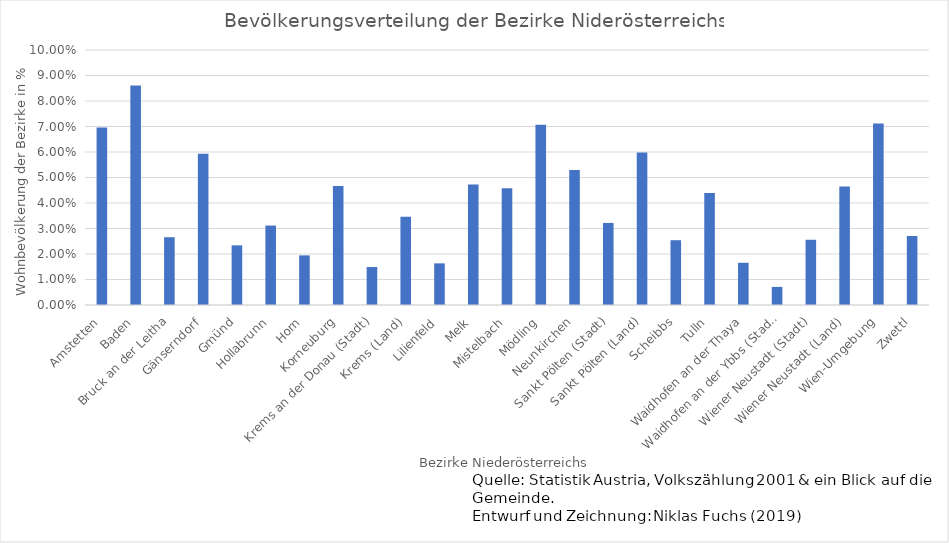
| Category | Series 0 |
|---|---|
| Amstetten | 0.07 |
| Baden | 0.086 |
| Bruck an der Leitha | 0.027 |
| Gänserndorf | 0.059 |
| Gmünd | 0.023 |
| Hollabrunn | 0.031 |
| Horn | 0.019 |
| Korneuburg | 0.047 |
| Krems an der Donau (Stadt) | 0.015 |
| Krems (Land) | 0.035 |
| Lilienfeld | 0.016 |
| Melk | 0.047 |
| Mistelbach | 0.046 |
| Mödling | 0.071 |
| Neunkirchen | 0.053 |
| Sankt Pölten (Stadt) | 0.032 |
| Sankt Pölten (Land) | 0.06 |
| Scheibbs | 0.025 |
| Tulln | 0.044 |
| Waidhofen an der Thaya | 0.017 |
| Waidhofen an der Ybbs (Stadt) | 0.007 |
| Wiener Neustadt (Stadt) | 0.026 |
| Wiener Neustadt (Land) | 0.046 |
| Wien-Umgebung | 0.071 |
| Zwettl | 0.027 |